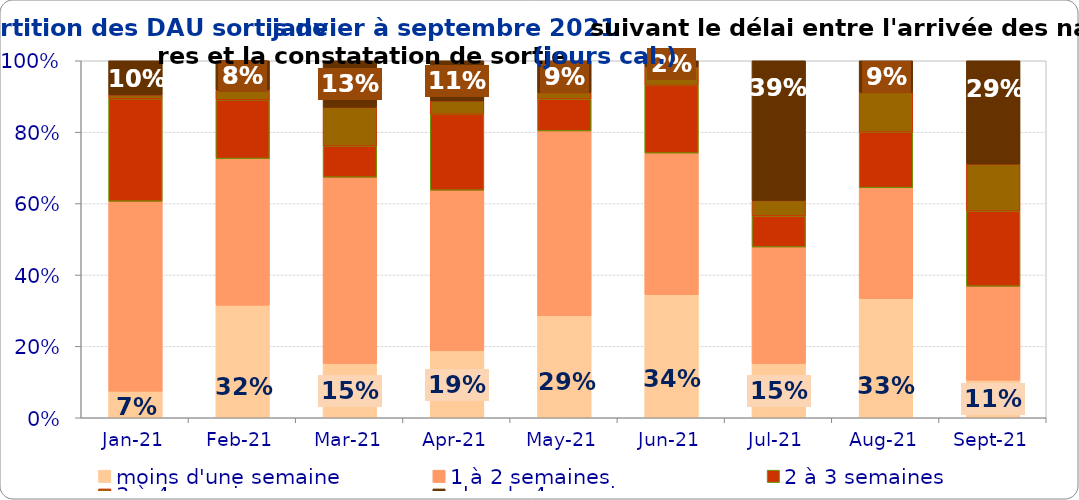
| Category | moins d'une semaine | 1 à 2 semaines | 2 à 3 semaines | 3 à 4 semaines | plus de 4 semaines |
|---|---|---|---|---|---|
| 2021-01-01 | 0.074 | 0.532 | 0.287 | 0.011 | 0.096 |
| 2021-02-01 | 0.315 | 0.411 | 0.164 | 0.027 | 0.082 |
| 2021-03-01 | 0.152 | 0.522 | 0.087 | 0.109 | 0.13 |
| 2021-04-01 | 0.188 | 0.45 | 0.212 | 0.038 | 0.112 |
| 2021-05-01 | 0.286 | 0.518 | 0.089 | 0.018 | 0.089 |
| 2021-06-01 | 0.345 | 0.397 | 0.19 | 0.052 | 0.017 |
| 2021-07-01 | 0.152 | 0.326 | 0.087 | 0.043 | 0.391 |
| 2021-08-01 | 0.333 | 0.311 | 0.156 | 0.111 | 0.089 |
| 2021-09-01 | 0.105 | 0.263 | 0.211 | 0.132 | 0.289 |